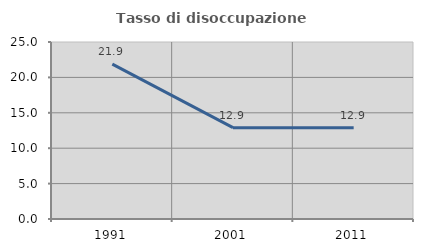
| Category | Tasso di disoccupazione giovanile  |
|---|---|
| 1991.0 | 21.875 |
| 2001.0 | 12.903 |
| 2011.0 | 12.903 |